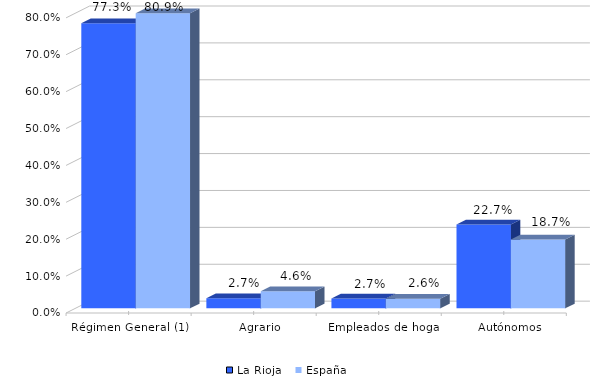
| Category | La Rioja | España |
|---|---|---|
| Régimen General (1) | 0.773 | 0.809 |
|    Agrario | 0.027 | 0.046 |
|    Empleados de hogar | 0.027 | 0.026 |
|    Autónomos | 0.227 | 0.187 |